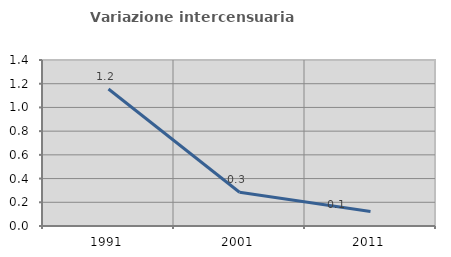
| Category | Variazione intercensuaria annua |
|---|---|
| 1991.0 | 1.156 |
| 2001.0 | 0.285 |
| 2011.0 | 0.122 |